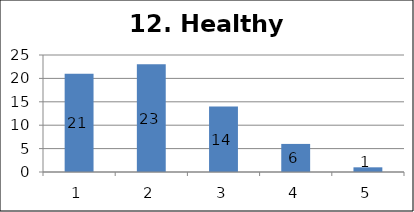
| Category | Series 1 |
|---|---|
| 0 | 21 |
| 1 | 23 |
| 2 | 14 |
| 3 | 6 |
| 4 | 1 |